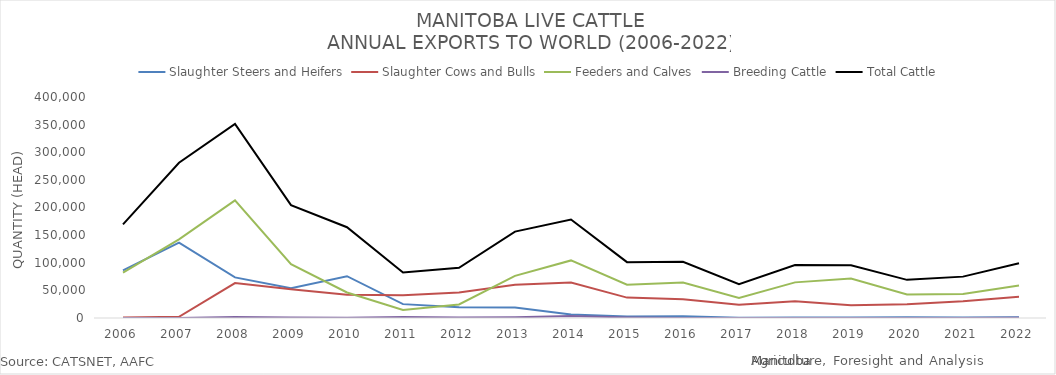
| Category | Slaughter Steers and Heifers | Slaughter Cows and Bulls | Feeders and Calves | Breeding Cattle | Total Cattle |
|---|---|---|---|---|---|
| 2006 | 86319 | 874 | 82178 | 0 | 169371 |
| 2007 | 136365 | 2188 | 142305 | 54 | 280912 |
| 2008 | 73457 | 63293 | 212971 | 1727 | 351448 |
| 2009 | 53889 | 52077 | 97433 | 993 | 204392 |
| 2010 | 75663 | 41989 | 46174 | 478 | 164304 |
| 2011 | 25107 | 41164 | 14370 | 1661 | 82302 |
| 2012 | 19479 | 45953 | 24417 | 972 | 90821 |
| 2013 | 18822 | 60057 | 76197 | 1296 | 156372 |
| 2014 | 6412 | 64114 | 104205 | 3407 | 178138 |
| 2015 | 2763 | 36890 | 60382 | 1087 | 101122 |
| 2016 | 3322 | 34100 | 64361 | 108 | 101891 |
| 2017 | 630 | 23972 | 36395 | 145 | 61142 |
| 2018 | 713 | 30471 | 64486 | 87 | 95757 |
| 2019 | 767 | 23257 | 71555 | 51 | 95630 |
| 2020 | 1512 | 24948 | 42425 | 170 | 69055 |
| 2021 | 796 | 30330 | 43564 | 195 | 74885 |
| 2022 | 1263 | 38559 | 58837 | 301 | 98960 |